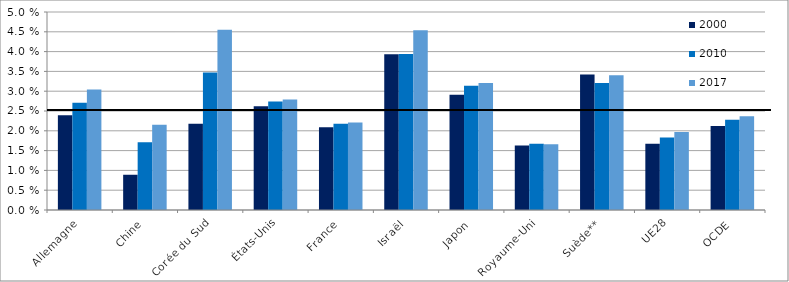
| Category | 2000 | 2010 | 2017 |
|---|---|---|---|
| Allemagne | 2.39 | 2.71 | 3.04 |
| Chine | 0.89 | 1.71 | 2.15 |
| Corée du Sud | 2.18 | 3.47 | 4.55 |
| États-Unis | 2.62 | 2.74 | 2.79 |
| France | 2.09 | 2.18 | 2.21 |
| Israël | 3.93 | 3.94 | 4.54 |
| Japon | 2.91 | 3.14 | 3.21 |
| Royaume-Uni | 1.63 | 1.67 | 1.66 |
| Suède** | 3.42 | 3.21 | 3.4 |
| UE28 | 1.67 | 1.83 | 1.97 |
| OCDE | 2.12 | 2.28 | 2.37 |